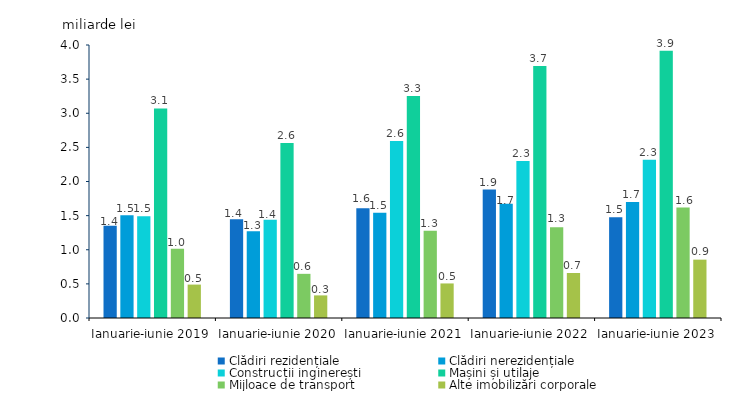
| Category | Clădiri rezidențiale | Clădiri nerezidențiale | Construcții inginerești | Mașini și utilaje | Mijloace de transport | Alte imobilizări corporale |
|---|---|---|---|---|---|---|
| Ianuarie-iunie 2019 | 1.352 | 1.504 | 1.492 | 3.071 | 1.014 | 0.49 |
| Ianuarie-iunie 2020 | 1.445 | 1.272 | 1.438 | 2.565 | 0.647 | 0.331 |
| Ianuarie-iunie 2021 | 1.609 | 1.543 | 2.593 | 3.254 | 1.278 | 0.506 |
| Ianuarie-iunie 2022 | 1.881 | 1.673 | 2.3 | 3.691 | 1.332 | 0.659 |
| Ianuarie-iunie 2023 | 1.477 | 1.699 | 2.319 | 3.915 | 1.62 | 0.855 |